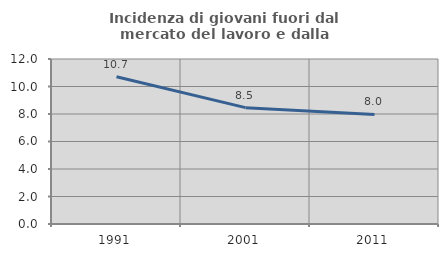
| Category | Incidenza di giovani fuori dal mercato del lavoro e dalla formazione  |
|---|---|
| 1991.0 | 10.706 |
| 2001.0 | 8.462 |
| 2011.0 | 7.97 |